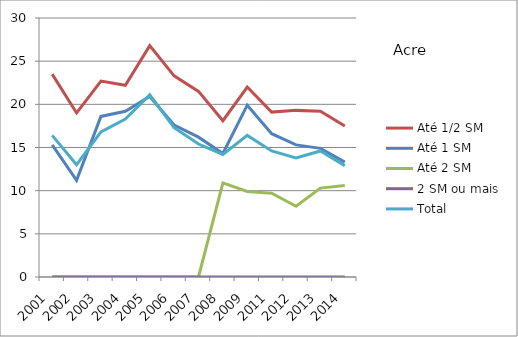
| Category | Até 1/2 SM | Até 1 SM | Até 2 SM | 2 SM ou mais | Total |
|---|---|---|---|---|---|
| 2001.0 | 23.5 | 15.3 | 0 | 0 | 16.4 |
| 2002.0 | 19 | 11.2 | 0 | 0 | 13 |
| 2003.0 | 22.7 | 18.6 | 0 | 0 | 16.8 |
| 2004.0 | 22.2 | 19.2 | 0 | 0 | 18.3 |
| 2005.0 | 26.8 | 20.9 | 0 | 0 | 21.1 |
| 2006.0 | 23.3 | 17.6 | 0 | 0 | 17.3 |
| 2007.0 | 21.5 | 16.2 | 0 | 0 | 15.4 |
| 2008.0 | 18.1 | 14.3 | 10.9 | 0 | 14.2 |
| 2009.0 | 22 | 19.9 | 9.9 | 0 | 16.4 |
| 2011.0 | 19.1 | 16.6 | 9.7 | 0 | 14.6 |
| 2012.0 | 19.3 | 15.3 | 8.2 | 0 | 13.8 |
| 2013.0 | 19.2 | 14.9 | 10.3 | 0 | 14.6 |
| 2014.0 | 17.5 | 13.3 | 10.6 | 0 | 12.9 |